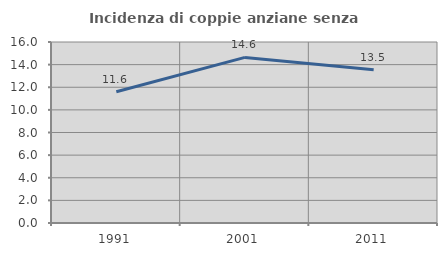
| Category | Incidenza di coppie anziane senza figli  |
|---|---|
| 1991.0 | 11.607 |
| 2001.0 | 14.637 |
| 2011.0 | 13.54 |